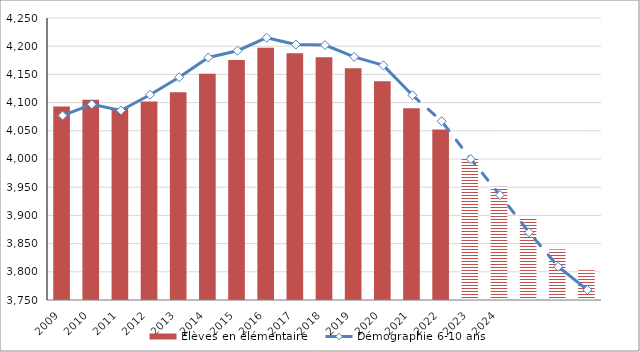
| Category | Élèves en élémentaire |
|---|---|
| 2009.0 | 4092.898 |
| 2010.0 | 4105.012 |
| 2011.0 | 4090.342 |
| 2012.0 | 4102.116 |
| 2013.0 | 4118.201 |
| 2014.0 | 4151.18 |
| 2015.0 | 4175.717 |
| 2016.0 | 4197.446 |
| 2017.0 | 4187.689 |
| 2018.0 | 4180.223 |
| 2019.0 | 4160.847 |
| 2020.0 | 4137.96 |
| 2021.0 | 4090.022 |
| 2022.0 | 4052.461 |
| 2023.0 | 4001.607 |
| 2024.0 | 3950.789 |